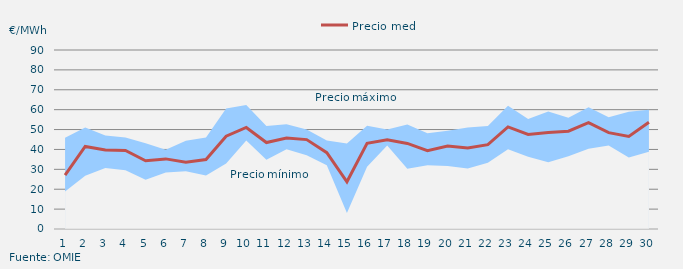
| Category | Precio medio |
|---|---|
| 1 | 27.055 |
| 2 | 41.521 |
| 3 | 39.747 |
| 4 | 39.461 |
| 5 | 34.331 |
| 6 | 35.25 |
| 7 | 33.577 |
| 8 | 34.96 |
| 9 | 46.653 |
| 10 | 51.057 |
| 11 | 43.456 |
| 12 | 45.698 |
| 13 | 44.95 |
| 14 | 38.402 |
| 15 | 23.723 |
| 16 | 43.124 |
| 17 | 44.916 |
| 18 | 43.034 |
| 19 | 39.348 |
| 20 | 41.745 |
| 21 | 40.727 |
| 22 | 42.405 |
| 23 | 51.305 |
| 24 | 47.552 |
| 25 | 48.541 |
| 26 | 49.173 |
| 27 | 53.457 |
| 28 | 48.454 |
| 29 | 46.503 |
| 30 | 53.673 |